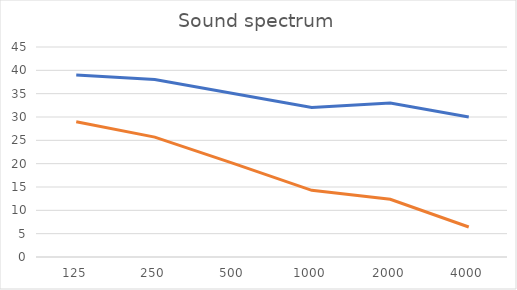
| Category | No Barrier | Barrier |
|---|---|---|
| 125.0 | 39.019 | 28.998 |
| 250.0 | 38.019 | 25.69 |
| 500.0 | 35.019 | 20.079 |
| 1000.0 | 32.019 | 14.282 |
| 2000.0 | 33.019 | 12.383 |
| 4000.0 | 30.019 | 6.43 |